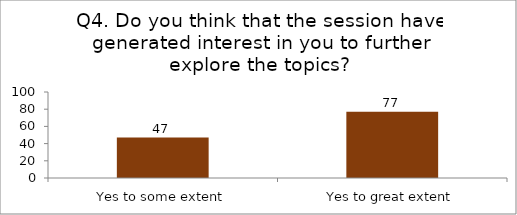
| Category | Q4. Do you think that the session have generated interest in you to further explore the topics? |
|---|---|
| Yes to some extent | 47 |
| Yes to great extent | 77 |